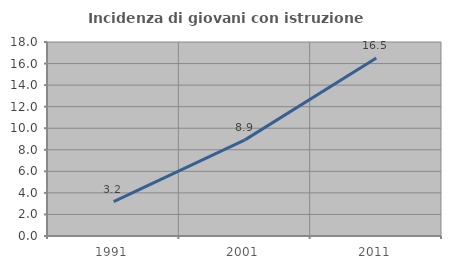
| Category | Incidenza di giovani con istruzione universitaria |
|---|---|
| 1991.0 | 3.189 |
| 2001.0 | 8.92 |
| 2011.0 | 16.524 |